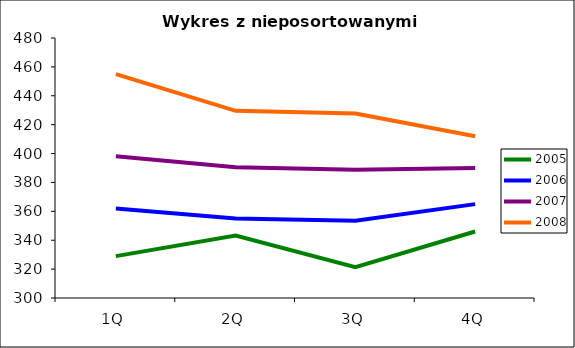
| Category | 2005 | 2006 | 2007 | 2008 |
|---|---|---|---|---|
| 1Q | 329 | 361.9 | 398.09 | 455 |
| 2Q | 343.2 | 355 | 390.5 | 429.55 |
| 3Q | 321.35 | 353.485 | 388.834 | 427.717 |
| 4Q | 346.05 | 365 | 390 | 412 |